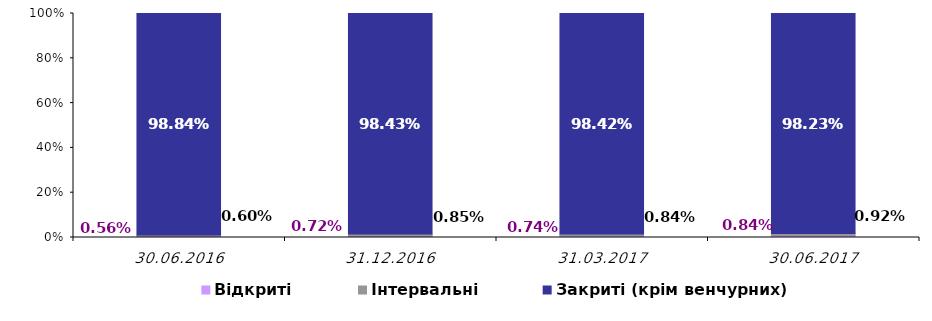
| Category | Відкриті | Інтервальні | Закриті (крім венчурних) |
|---|---|---|---|
| 30.06.2016 | 0.006 | 0.006 | 0.988 |
| 31.12.2016 | 0.007 | 0.008 | 0.984 |
| 31.03.2017 | 0.007 | 0.008 | 0.984 |
| 30.06.2017 | 0.008 | 0.009 | 0.982 |